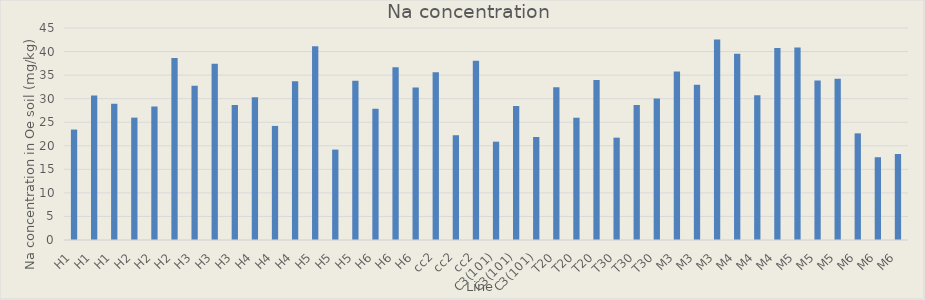
| Category | Series 0 |
|---|---|
| H1 | 23.439 |
| H1 | 30.671 |
| H1 | 28.947 |
| H2 | 25.975 |
| H2 | 28.342 |
| H2 | 38.63 |
| H3 | 32.746 |
| H3 | 37.417 |
| H3 | 28.663 |
| H4 | 30.313 |
| H4 | 24.216 |
| H4 | 33.686 |
| H5 | 41.152 |
| H5 | 19.192 |
| H5 | 33.792 |
| H6 | 27.885 |
| H6 | 36.679 |
| H6 | 32.351 |
| cc2 | 35.616 |
| cc2 | 22.237 |
| cc2 | 38.035 |
| C3(101) | 20.875 |
| C3(101) | 28.459 |
| C3(101) | 21.868 |
| T20 | 32.445 |
| T20 | 25.952 |
| T20 | 33.969 |
| T30 | 21.724 |
| T30 | 28.682 |
| T30 | 30.024 |
| M3 | 35.778 |
| M3 | 32.967 |
| M3 | 42.577 |
| M4 | 39.553 |
| M4 | 30.745 |
| M4 | 40.77 |
| M5 | 40.847 |
| M5 | 33.869 |
| M5 | 34.219 |
| M6 | 22.642 |
| M6 | 17.571 |
| M6 | 18.25 |